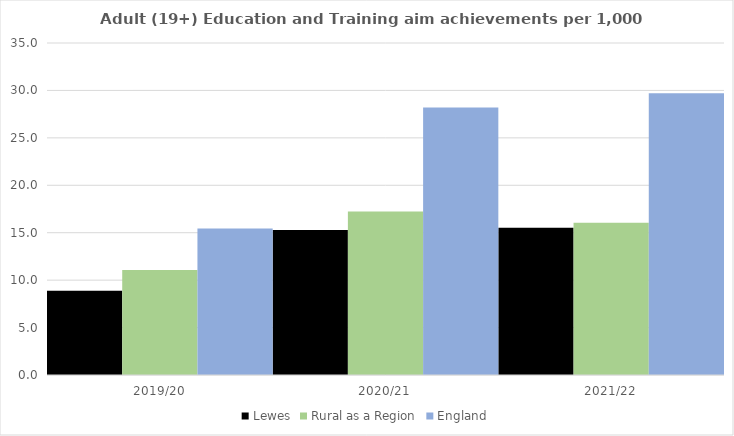
| Category | Lewes | Rural as a Region | England |
|---|---|---|---|
| 2019/20 | 8.888 | 11.081 | 15.446 |
| 2020/21 | 15.273 | 17.224 | 28.211 |
| 2021/22 | 15.514 | 16.063 | 29.711 |